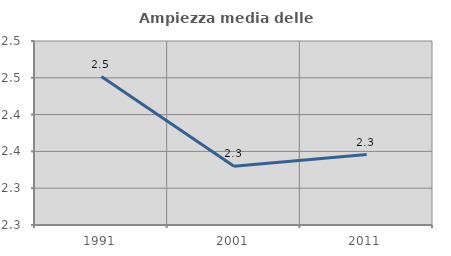
| Category | Ampiezza media delle famiglie |
|---|---|
| 1991.0 | 2.452 |
| 2001.0 | 2.33 |
| 2011.0 | 2.346 |